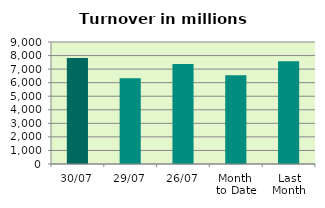
| Category | Series 0 |
|---|---|
| 30/07 | 7811.095 |
| 29/07 | 6334.006 |
| 26/07 | 7376.713 |
| Month 
to Date | 6546.651 |
| Last
Month | 7579.876 |